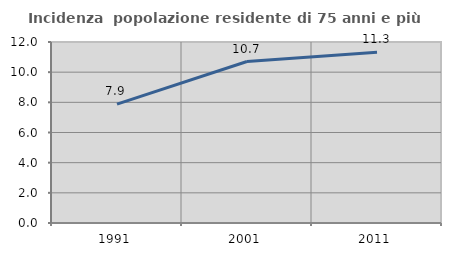
| Category | Incidenza  popolazione residente di 75 anni e più |
|---|---|
| 1991.0 | 7.877 |
| 2001.0 | 10.705 |
| 2011.0 | 11.316 |